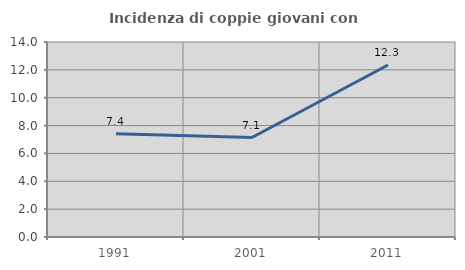
| Category | Incidenza di coppie giovani con figli |
|---|---|
| 1991.0 | 7.407 |
| 2001.0 | 7.143 |
| 2011.0 | 12.346 |